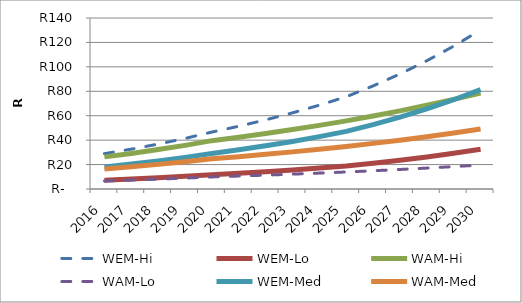
| Category | WEM-Hi | WEM-Lo | WAM-Hi | WAM-Lo | WEM-Med | WAM-Med |
|---|---|---|---|---|---|---|
| 2016.0 | 28.93 | 7.233 | 26.292 | 6.573 | 18.081 | 16.433 |
| 2017.0 | 32.623 | 8.156 | 29.124 | 7.281 | 20.389 | 18.203 |
| 2018.0 | 36.764 | 9.191 | 32.26 | 8.065 | 22.978 | 20.162 |
| 2019.0 | 41.408 | 10.352 | 35.731 | 8.933 | 25.88 | 22.332 |
| 2020.0 | 46.612 | 11.653 | 39.575 | 9.894 | 29.133 | 24.734 |
| 2021.0 | 51.377 | 12.844 | 42.394 | 10.598 | 32.11 | 26.496 |
| 2022.0 | 56.605 | 14.151 | 45.411 | 11.353 | 35.378 | 28.382 |
| 2023.0 | 62.341 | 15.585 | 48.639 | 12.16 | 38.963 | 30.4 |
| 2024.0 | 68.632 | 17.158 | 52.094 | 13.023 | 42.895 | 32.558 |
| 2025.0 | 75.531 | 18.883 | 55.789 | 13.947 | 47.207 | 34.868 |
| 2026.0 | 84.39 | 21.097 | 59.749 | 14.937 | 52.744 | 37.343 |
| 2027.0 | 94.183 | 23.546 | 63.986 | 15.997 | 58.864 | 39.991 |
| 2028.0 | 105.003 | 26.251 | 68.519 | 17.13 | 65.627 | 42.824 |
| 2029.0 | 116.951 | 29.238 | 73.367 | 18.342 | 73.094 | 45.854 |
| 2030.0 | 130.139 | 32.535 | 78.552 | 19.638 | 81.337 | 49.095 |